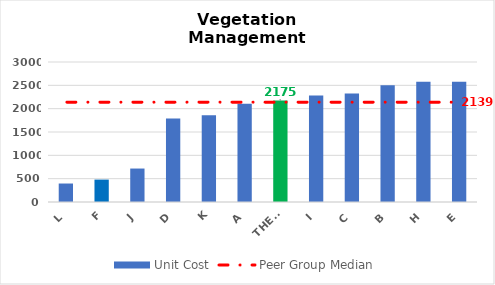
| Category | Unit Cost |
|---|---|
| L | 396 |
| F | 480 |
| J | 717 |
| D | 1789.2 |
| K | 1860 |
| A | 2103.54 |
| THESL | 2175.083 |
| I | 2283.73 |
| C | 2324.214 |
| B | 2502.022 |
| H | 2576.639 |
| E | 2578.226 |